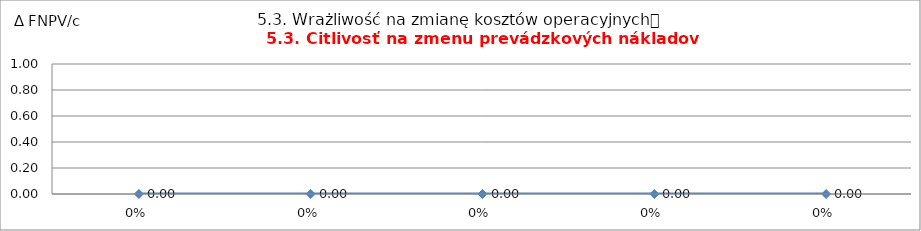
| Category | 6.3. Wrażliwość na zmianę kosztów operacyjnych
6.3. Citlivosť na zmenu prevádzkových nákladov |
|---|---|
| 0.0 | 0 |
| 0.0 | 0 |
| 0.0 | 0 |
| 0.0 | 0 |
| 0.0 | 0 |